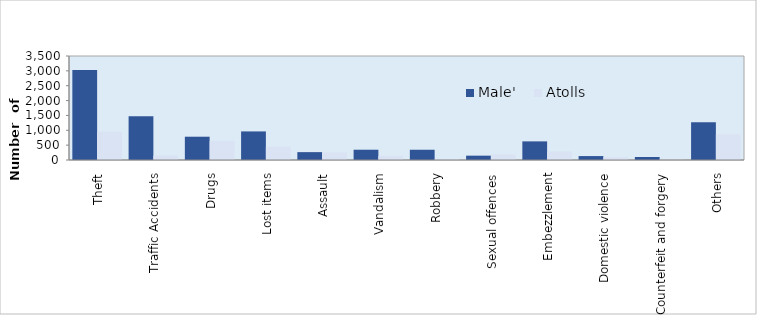
| Category | Male' | Atolls |
|---|---|---|
| Theft | 3030 | 952 |
| Traffic Accidents | 1469 | 149 |
| Drugs | 784 | 645 |
| Lost items | 962 | 450 |
| Assault | 265 | 256 |
| Vandalism | 346 | 136 |
| Robbery | 345 | 27 |
| Sexual offences | 146 | 188 |
| Embezzlement | 627 | 287 |
| Domestic violence | 132 | 96 |
| Counterfeit and forgery | 101 | 15 |
| Others | 1271 | 864 |